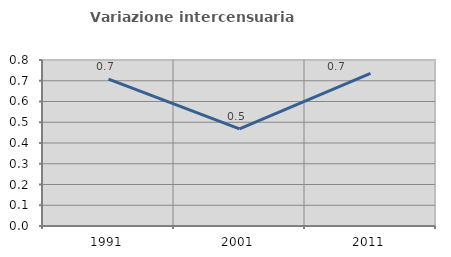
| Category | Variazione intercensuaria annua |
|---|---|
| 1991.0 | 0.708 |
| 2001.0 | 0.468 |
| 2011.0 | 0.736 |